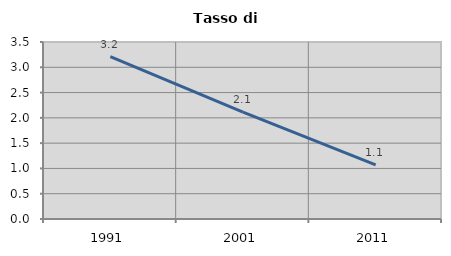
| Category | Tasso di disoccupazione   |
|---|---|
| 1991.0 | 3.213 |
| 2001.0 | 2.114 |
| 2011.0 | 1.069 |